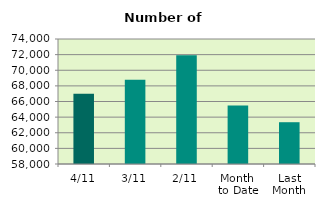
| Category | Series 0 |
|---|---|
| 4/11 | 67004 |
| 3/11 | 68792 |
| 2/11 | 71912 |
| Month 
to Date | 65494 |
| Last
Month | 63348.667 |